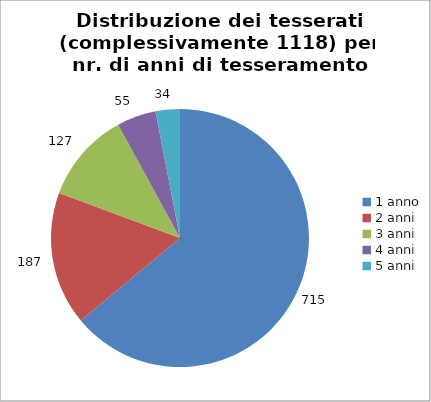
| Category | Nr. Tesserati |
|---|---|
| 1 anno | 715 |
| 2 anni | 187 |
| 3 anni | 127 |
| 4 anni | 55 |
| 5 anni | 34 |